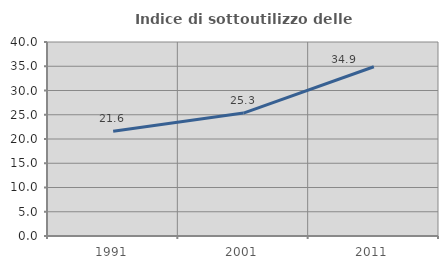
| Category | Indice di sottoutilizzo delle abitazioni  |
|---|---|
| 1991.0 | 21.598 |
| 2001.0 | 25.344 |
| 2011.0 | 34.889 |